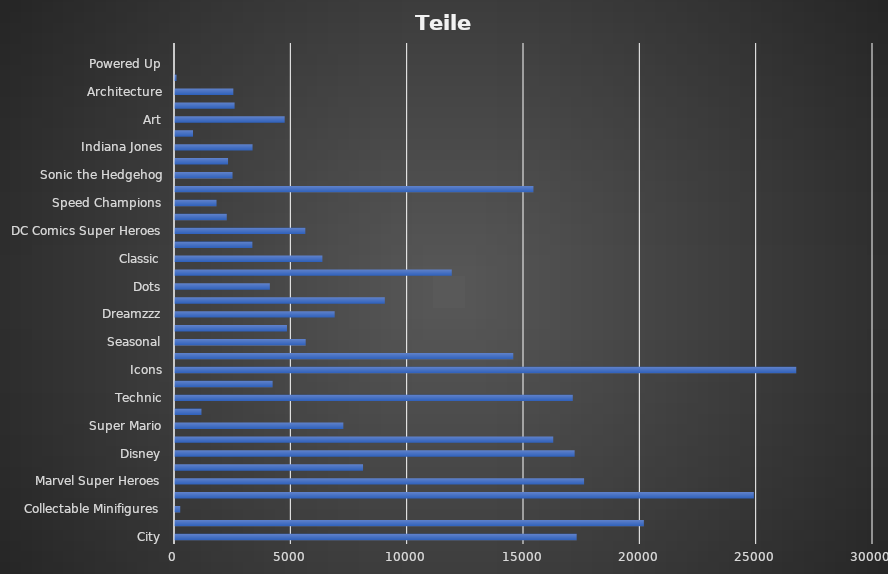
| Category | Teile |
|---|---|
| City | 17264 |
| Friends | 20152 |
| Collectable Minifigures | 225 |
| Star Wars | 24880 |
| Marvel Super Heroes | 17582 |
| Creator | 8082 |
| Disney | 17177 |
| Ninjago | 16257 |
| Super Mario | 7235 |
| Duplo | 1137 |
| Technic | 17097 |
| BrickHeadz | 4196 |
| Icons | 26701 |
| Harry Potter | 14539 |
| Seasonal | 5617 |
| Minecraft | 4813 |
| Dreamzzz | 6863 |
| Monkie Kid | 9018 |
| Dots | 4076 |
| Ideas | 11896 |
| Classic | 6335 |
| Promotional | 3326 |
| DC Comics Super Heroes | 5601 |
| Jurassic World | 2225 |
| Speed Champions | 1785 |
| Bricklink | 15406 |
| Sonic the Hedgehog | 2473 |
| Avatar | 2280 |
| Indiana Jones | 3333 |
| Gabby's Dollhouse | 774 |
| Art | 4714 |
| Education | 2561 |
| Architecture | 2507 |
| LEGO Games | 65 |
| Powered Up | 0 |